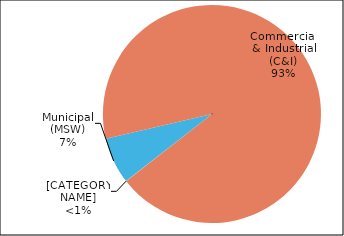
| Category | Series 0 |
|---|---|
| Municipal (MSW) | 102437 |
| Commercial & Industrial (C&I) | 1378409 |
| Construction & Demolition (C&D) | 171 |